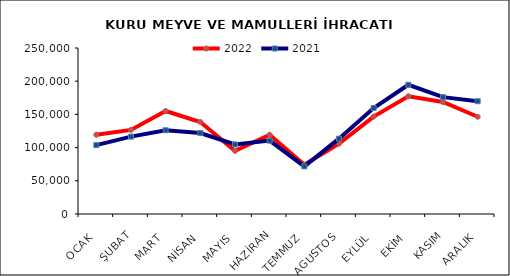
| Category | 2022 | 2021 |
|---|---|---|
| OCAK | 119386.623 | 103715.162 |
| ŞUBAT | 126675.828 | 116565.357 |
| MART | 155085.145 | 126148.16 |
| NİSAN | 138449.59 | 121879.304 |
| MAYIS | 95080.687 | 104753.488 |
| HAZİRAN | 119344.378 | 110501.729 |
| TEMMUZ | 74195.328 | 71747.926 |
| AGUSTOS | 106005.399 | 113456.225 |
| EYLÜL | 146747.732 | 159668.88 |
| EKİM | 177273.607 | 194546.332 |
| KASIM | 168780.449 | 175975.253 |
| ARALIK | 146438.93 | 169857.972 |